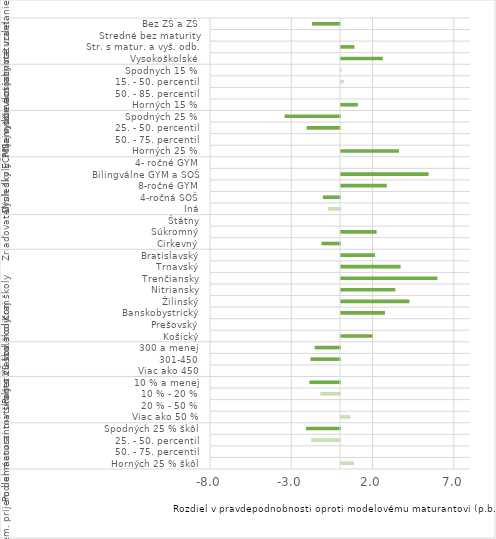
| Category | Rozdiel (p.b.) |
|---|---|
| 0 | 0.794 |
| 1 | 0 |
| 2 | -1.781 |
| 3 | -2.089 |
| 4 | 0.563 |
| 5 | 0 |
| 6 | -1.214 |
| 7 | -1.881 |
| 8 | 0 |
| 9 | -1.821 |
| 10 | -1.557 |
| 11 | 1.937 |
| 12 | 0 |
| 13 | 2.703 |
| 14 | 4.209 |
| 15 | 3.343 |
| 16 | 5.93 |
| 17 | 3.669 |
| 18 | 2.09 |
| 19 | -1.142 |
| 20 | 2.192 |
| 21 | 0 |
| 22 | -0.726 |
| 23 | -1.052 |
| 24 | 2.817 |
| 25 | 5.391 |
| 26 | 0 |
| 27 | 3.564 |
| 28 | 0 |
| 29 | -2.051 |
| 30 | -3.409 |
| 31 | 1.038 |
| 32 | 0 |
| 33 | 0.165 |
| 34 | 0.035 |
| 35 | 2.575 |
| 36 | 0.822 |
| 37 | 0 |
| 38 | -1.721 |